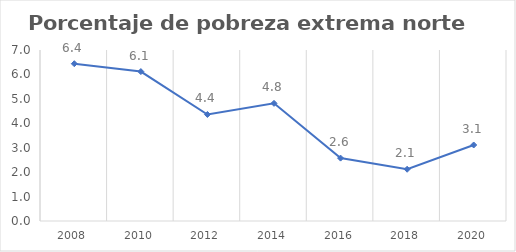
| Category | Series 0 |
|---|---|
| 2008.0 | 6.439 |
| 2010.0 | 6.117 |
| 2012.0 | 4.36 |
| 2014.0 | 4.817 |
| 2016.0 | 2.574 |
| 2018.0 | 2.119 |
| 2020.0 | 3.111 |